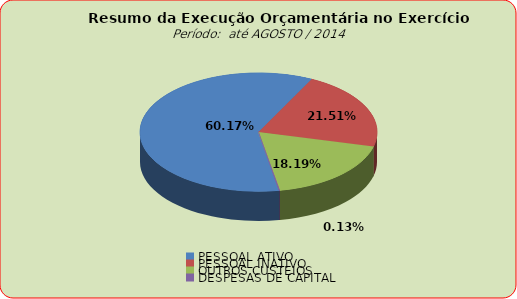
| Category | Series 0 |
|---|---|
| PESSOAL ATIVO | 79796983.36 |
| PESSOAL INATIVO | 28528419.16 |
| OUTROS CUSTEIOS | 24128632.69 |
| DESPESAS DE CAPITAL | 165839.25 |